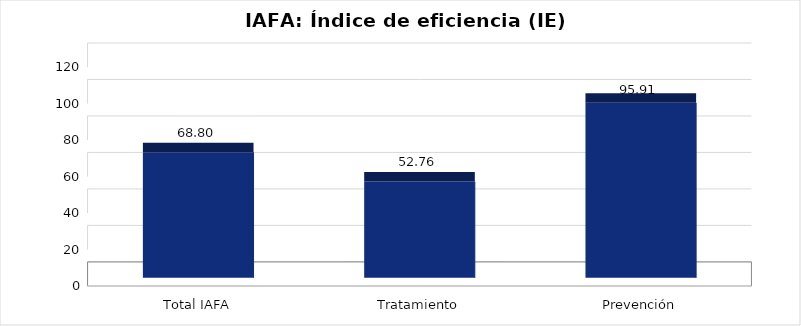
| Category | Índice de eficiencia (IE)  |
|---|---|
| Total IAFA | 68.801 |
| Tratamiento | 52.758 |
| Prevención | 95.912 |